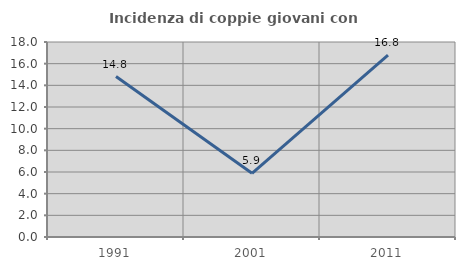
| Category | Incidenza di coppie giovani con figli |
|---|---|
| 1991.0 | 14.815 |
| 2001.0 | 5.882 |
| 2011.0 | 16.779 |